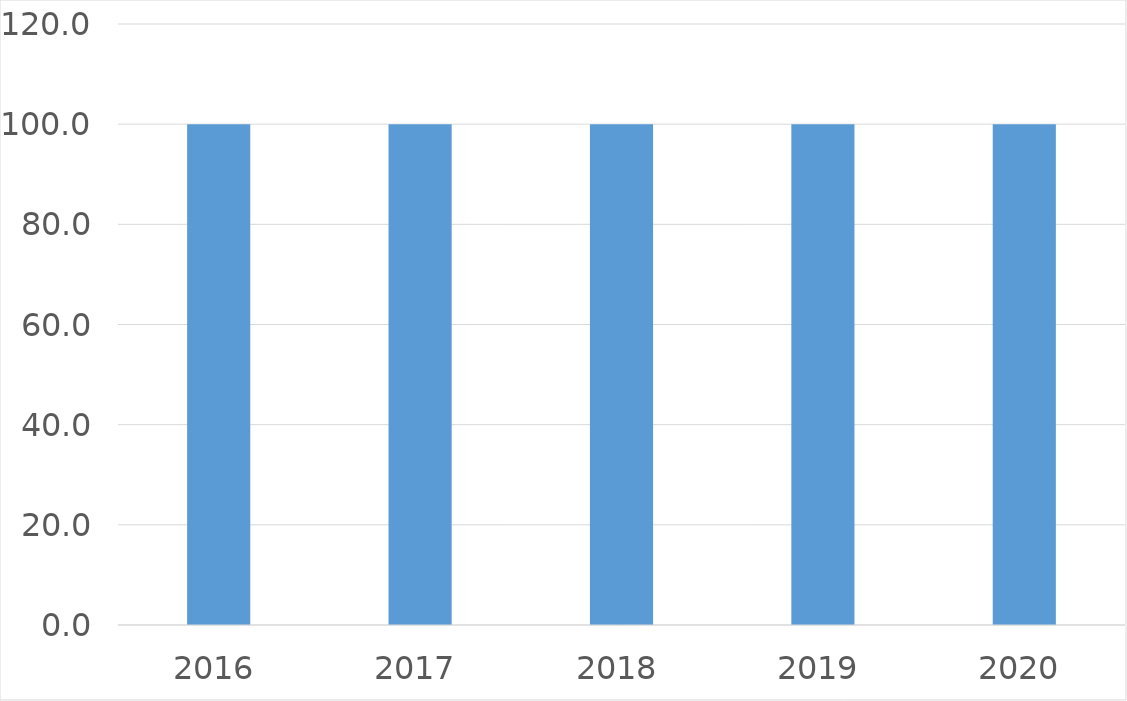
| Category | Series 0 |
|---|---|
| 2016 | 100 |
| 2017 | 100 |
| 2018 | 100 |
| 2019 | 100 |
| 2020 | 100 |